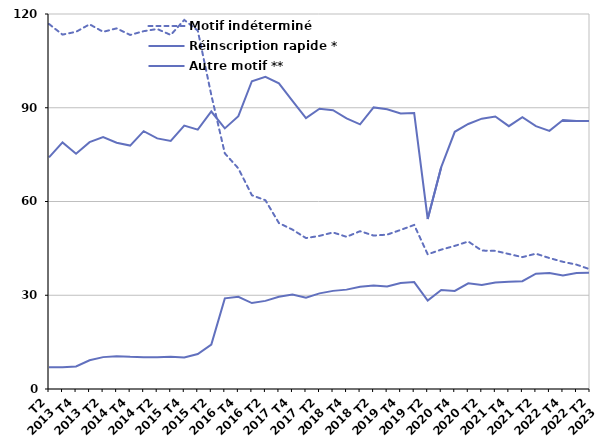
| Category | Motif indéterminé | Réinscription rapide * | Autre motif ** |
|---|---|---|---|
| T2
2013 | 116.8 | 74.1 | 7 |
| T3
2013 | 113.4 | 78.9 | 7 |
| T4
2013 | 114.3 | 75.3 | 7.2 |
| T1
2014 | 116.7 | 79 | 9.2 |
| T2
2014 | 114.3 | 80.6 | 10.2 |
| T3
2014 | 115.4 | 78.8 | 10.5 |
| T4
2014 | 113.3 | 77.9 | 10.3 |
| T1
2015 | 114.5 | 82.5 | 10.2 |
| T2
2015 | 115.2 | 80.2 | 10.2 |
| T3
2015 | 113.3 | 79.4 | 10.3 |
| T4
2015 | 118.1 | 84.3 | 10.1 |
| T1
2016 | 114.7 | 83 | 11.2 |
| T2
2016 | 94.1 | 88.8 | 14.2 |
| T3
2016 | 75.4 | 83.4 | 29 |
| T4
2016 | 70.6 | 87.3 | 29.5 |
| T1
2017 | 62 | 98.5 | 27.5 |
| T2
2017 | 60.4 | 99.9 | 28.2 |
| T3
2017 | 53.1 | 97.8 | 29.5 |
| T4
2017 | 51 | 92.2 | 30.2 |
| T1
2018 | 48.3 | 86.7 | 29.2 |
| T2
2018 | 49 | 89.7 | 30.6 |
| T3
2018 | 50.1 | 89.2 | 31.4 |
| T4
2018 | 48.7 | 86.6 | 31.8 |
| T1
2019 | 50.5 | 84.7 | 32.7 |
| T2
2019 | 49.1 | 90.1 | 33.1 |
| T3
2019 | 49.4 | 89.5 | 32.8 |
| T4
2019 | 50.9 | 88.2 | 33.9 |
| T1
2020 | 52.5 | 88.3 | 34.2 |
| T2
2020 | 43.1 | 54.4 | 28.3 |
| T3
2020 | 44.6 | 71 | 31.7 |
| T4
2020 | 45.8 | 82.3 | 31.4 |
| T1
2021 | 47.2 | 84.8 | 33.8 |
| T2
2021 | 44.3 | 86.5 | 33.3 |
| T3
2021 | 44.2 | 87.2 | 34.1 |
| T4
2021 | 43.2 | 84.1 | 34.3 |
| T1
2022 | 42.2 | 87 | 34.5 |
| T2
2022 | 43.3 | 84.1 | 36.9 |
| T3
2022 | 41.9 | 82.6 | 37.1 |
| T4
2022 | 40.7 | 86.1 | 36.3 |
| T1
2023 | 39.8 | 85.8 | 37.1 |
| T2
2023 | 38.3 | 85.8 | 37.2 |